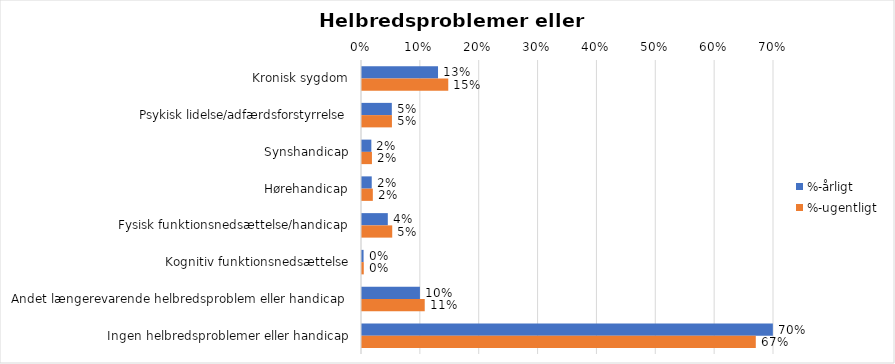
| Category | %-årligt | %-ugentligt |
|---|---|---|
| Kronisk sygdom | 0.129 | 0.147 |
| Psykisk lidelse/adfærdsforstyrrelse | 0.051 | 0.051 |
| Synshandicap | 0.016 | 0.017 |
| Hørehandicap | 0.017 | 0.018 |
| Fysisk funktionsnedsættelse/handicap | 0.044 | 0.051 |
| Kognitiv funktionsnedsættelse | 0.003 | 0.003 |
| Andet længerevarende helbredsproblem eller handicap  | 0.098 | 0.107 |
| Ingen helbredsproblemer eller handicap | 0.698 | 0.669 |